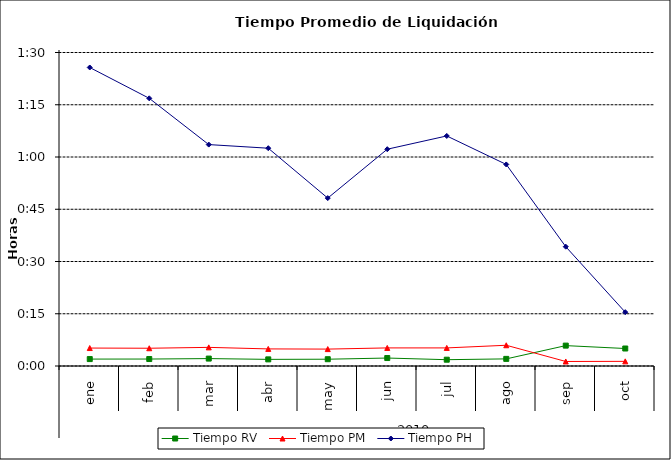
| Category | Tiempo RV | Tiempo PM | Tiempo PH |
|---|---|---|---|
| 0 | 0.001 | 0.004 | 0.06 |
| 1 | 0.001 | 0.004 | 0.053 |
| 2 | 0.001 | 0.004 | 0.044 |
| 3 | 0.001 | 0.003 | 0.043 |
| 4 | 0.001 | 0.003 | 0.033 |
| 5 | 0.002 | 0.004 | 0.043 |
| 6 | 0.001 | 0.004 | 0.046 |
| 7 | 0.001 | 0.004 | 0.04 |
| 8 | 0.004 | 0.001 | 0.024 |
| 9 | 0.003 | 0.001 | 0.011 |